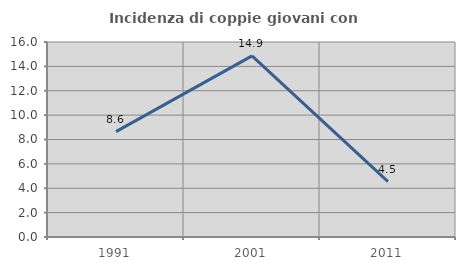
| Category | Incidenza di coppie giovani con figli |
|---|---|
| 1991.0 | 8.642 |
| 2001.0 | 14.865 |
| 2011.0 | 4.545 |